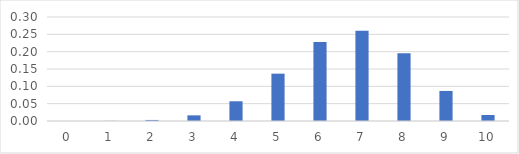
| Category | Series 0 |
|---|---|
| 0.0 | 0 |
| 1.0 | 0 |
| 2.0 | 0.003 |
| 3.0 | 0.016 |
| 4.0 | 0.057 |
| 5.0 | 0.137 |
| 6.0 | 0.228 |
| 7.0 | 0.26 |
| 8.0 | 0.195 |
| 9.0 | 0.087 |
| 10.0 | 0.017 |